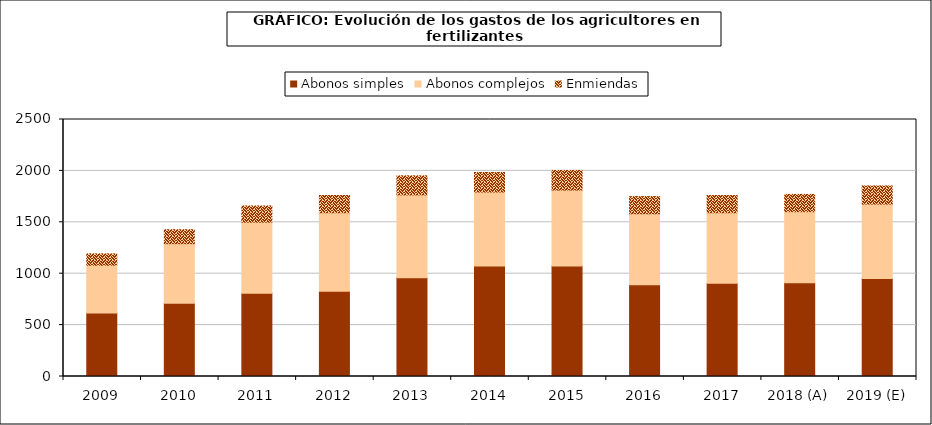
| Category | Abonos simples | Abonos complejos | Enmiendas |
|---|---|---|---|
| 2009 | 617.926 | 464.475 | 110.568 |
| 2010 | 711.864 | 580.242 | 135.989 |
| 2011 | 809.32 | 692.087 | 157.487 |
| 2012 | 828.171 | 764.88 | 167.637 |
| 2013 | 959.679 | 806.665 | 185.766 |
| 2014 | 1074.953 | 720.53 | 188.831 |
| 2015 | 1074.955 | 739.068 | 190.781 |
| 2016 | 891.426 | 691.817 | 166.51 |
| 2017 | 906.183 | 686.53 | 167.506 |
| 2018 (A) | 911.992 | 690.931 | 168.579 |
| 2019 (E) | 954.361 | 723.03 | 176.411 |